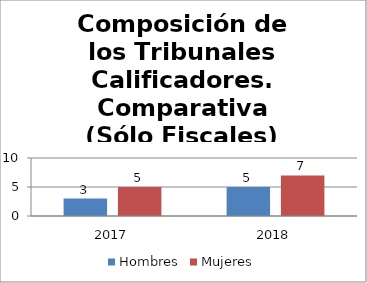
| Category | Hombres | Mujeres |
|---|---|---|
| 2017.0 | 3 | 5 |
| 2018.0 | 5 | 7 |